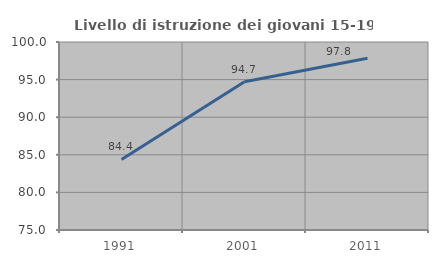
| Category | Livello di istruzione dei giovani 15-19 anni |
|---|---|
| 1991.0 | 84.382 |
| 2001.0 | 94.704 |
| 2011.0 | 97.835 |